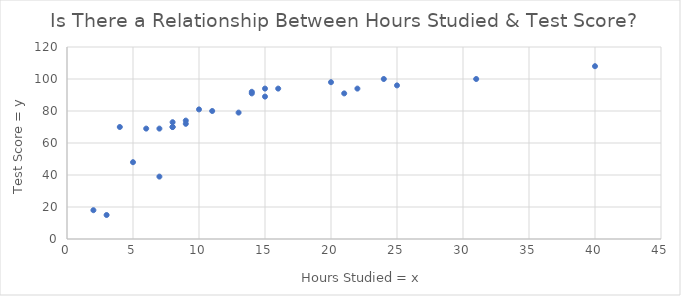
| Category | Test Score = y |
|---|---|
| 7.0 | 69 |
| 20.0 | 98 |
| 13.0 | 79 |
| 9.0 | 72 |
| 5.0 | 48 |
| 15.0 | 94 |
| 22.0 | 94 |
| 14.0 | 92 |
| 31.0 | 100 |
| 2.0 | 18 |
| 8.0 | 70 |
| 6.0 | 69 |
| 10.0 | 81 |
| 16.0 | 94 |
| 3.0 | 15 |
| 24.0 | 100 |
| 8.0 | 73 |
| 40.0 | 108 |
| 15.0 | 89 |
| 25.0 | 96 |
| 21.0 | 91 |
| 7.0 | 39 |
| 9.0 | 74 |
| 11.0 | 80 |
| 14.0 | 91 |
| 4.0 | 70 |
| 8.0 | 70 |